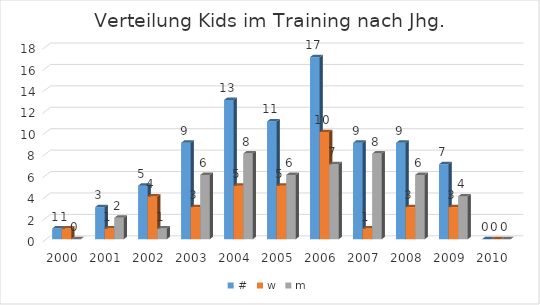
| Category | # | w | m |
|---|---|---|---|
| 2000.0 | 1 | 1 | 0 |
| 2001.0 | 3 | 1 | 2 |
| 2002.0 | 5 | 4 | 1 |
| 2003.0 | 9 | 3 | 6 |
| 2004.0 | 13 | 5 | 8 |
| 2005.0 | 11 | 5 | 6 |
| 2006.0 | 17 | 10 | 7 |
| 2007.0 | 9 | 1 | 8 |
| 2008.0 | 9 | 3 | 6 |
| 2009.0 | 7 | 3 | 4 |
| 2010.0 | 0 | 0 | 0 |